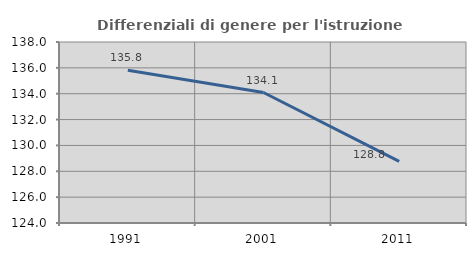
| Category | Differenziali di genere per l'istruzione superiore |
|---|---|
| 1991.0 | 135.82 |
| 2001.0 | 134.092 |
| 2011.0 | 128.772 |